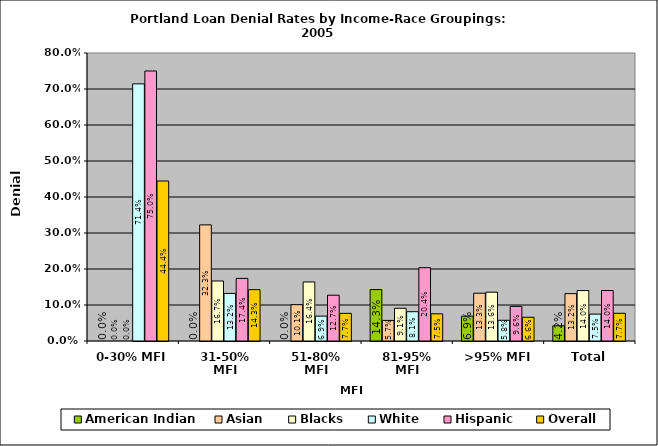
| Category | American Indian | Asian | Blacks | White | Hispanic | Overall |
|---|---|---|---|---|---|---|
| 0-30% MFI | 0 | 0 | 0 | 0.714 | 0.75 | 0.444 |
| 31-50% MFI | 0 | 0.323 | 0.167 | 0.132 | 0.174 | 0.143 |
| 51-80% MFI | 0 | 0.101 | 0.164 | 0.069 | 0.127 | 0.077 |
| 81-95% MFI | 0.143 | 0.057 | 0.091 | 0.081 | 0.204 | 0.075 |
| >95% MFI | 0.069 | 0.133 | 0.136 | 0.058 | 0.096 | 0.066 |
| Total | 0.042 | 0.132 | 0.14 | 0.075 | 0.14 | 0.077 |